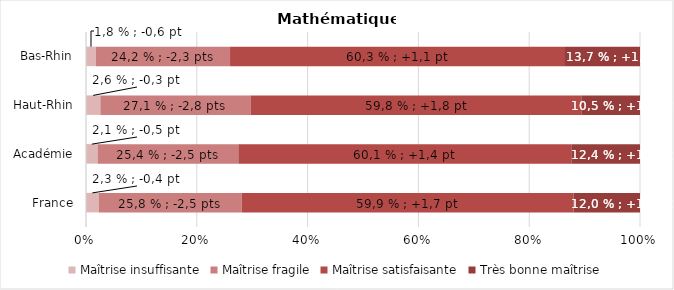
| Category | Maîtrise insuffisante | Maîtrise fragile | Maîtrise satisfaisante | Très bonne maîtrise |
|---|---|---|---|---|
| France | 2.3 | 25.8 | 59.9 | 12 |
| Académie | 2.1 | 25.4 | 60.1 | 12.4 |
| Haut-Rhin | 2.6 | 27.1 | 59.8 | 10.5 |
| Bas-Rhin | 1.8 | 24.2 | 60.3 | 13.7 |